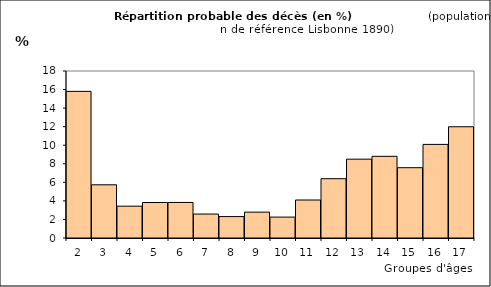
| Category | Series 0 |
|---|---|
| 2.0 | 15.804 |
| 3.0 | 5.733 |
| 4.0 | 3.43 |
| 5.0 | 3.826 |
| 6.0 | 3.832 |
| 7.0 | 2.581 |
| 8.0 | 2.308 |
| 9.0 | 2.788 |
| 10.0 | 2.252 |
| 11.0 | 4.095 |
| 12.0 | 6.393 |
| 13.0 | 8.498 |
| 14.0 | 8.804 |
| 15.0 | 7.578 |
| 16.0 | 10.088 |
| 17.0 | 11.99 |